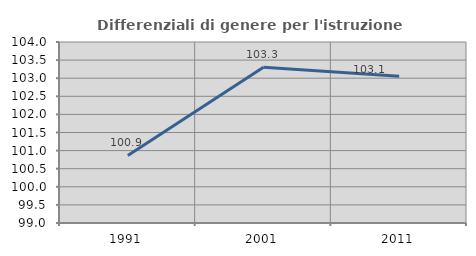
| Category | Differenziali di genere per l'istruzione superiore |
|---|---|
| 1991.0 | 100.866 |
| 2001.0 | 103.301 |
| 2011.0 | 103.051 |